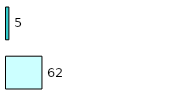
| Category | Series 0 | Series 1 |
|---|---|---|
| 0 | 62 | 5 |